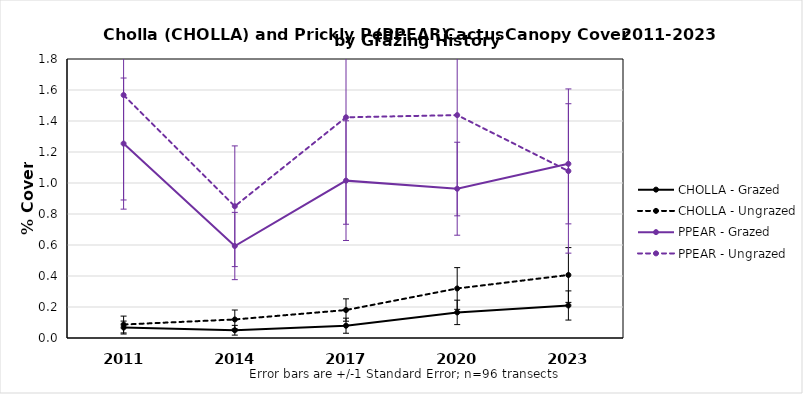
| Category | CHOLLA - Grazed | CHOLLA - Ungrazed | PPEAR - Grazed | PPEAR - Ungrazed |
|---|---|---|---|---|
| 2011.0 | 0.067 | 0.087 | 1.254 | 1.567 |
| 2014.0 | 0.05 | 0.12 | 0.593 | 0.85 |
| 2017.0 | 0.079 | 0.18 | 1.015 | 1.424 |
| 2020.0 | 0.165 | 0.32 | 0.963 | 1.438 |
| 2023.0 | 0.21 | 0.407 | 1.124 | 1.077 |